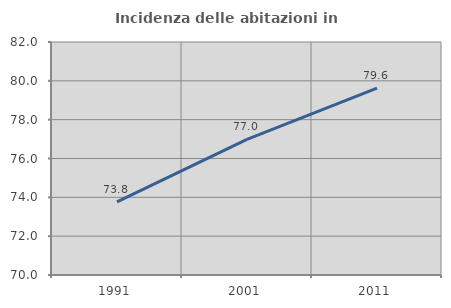
| Category | Incidenza delle abitazioni in proprietà  |
|---|---|
| 1991.0 | 73.766 |
| 2001.0 | 76.984 |
| 2011.0 | 79.625 |